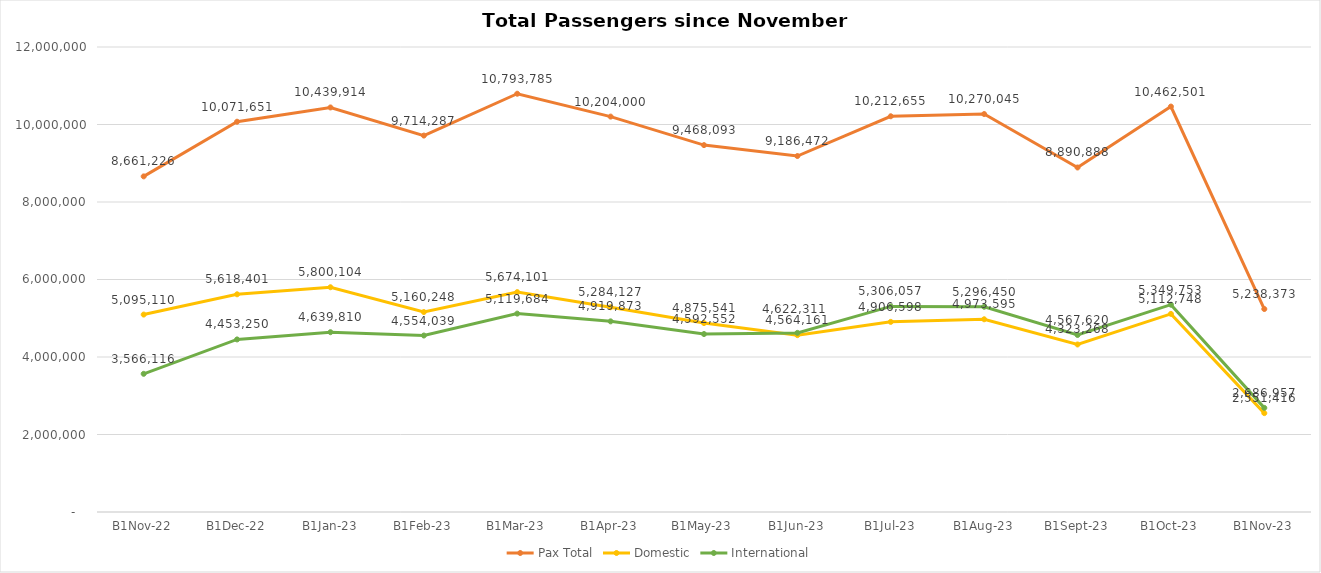
| Category | Pax Total | Domestic | International |
|---|---|---|---|
| 2022-11-01 | 8661226 | 5095110 | 3566116 |
| 2022-12-01 | 10071651 | 5618401 | 4453250 |
| 2023-01-01 | 10439914 | 5800104 | 4639810 |
| 2023-02-01 | 9714287 | 5160248 | 4554039 |
| 2023-03-01 | 10793785 | 5674101 | 5119684 |
| 2023-04-01 | 10204000 | 5284127 | 4919873 |
| 2023-05-01 | 9468093 | 4875541 | 4592552 |
| 2023-06-01 | 9186472 | 4564161 | 4622311 |
| 2023-07-01 | 10212655 | 4906598 | 5306057 |
| 2023-08-01 | 10270045 | 4973595 | 5296450 |
| 2023-09-01 | 8890888 | 4323268 | 4567620 |
| 2023-10-01 | 10462501 | 5112748 | 5349753 |
| 2023-11-01 | 5238373 | 2551416 | 2686957 |